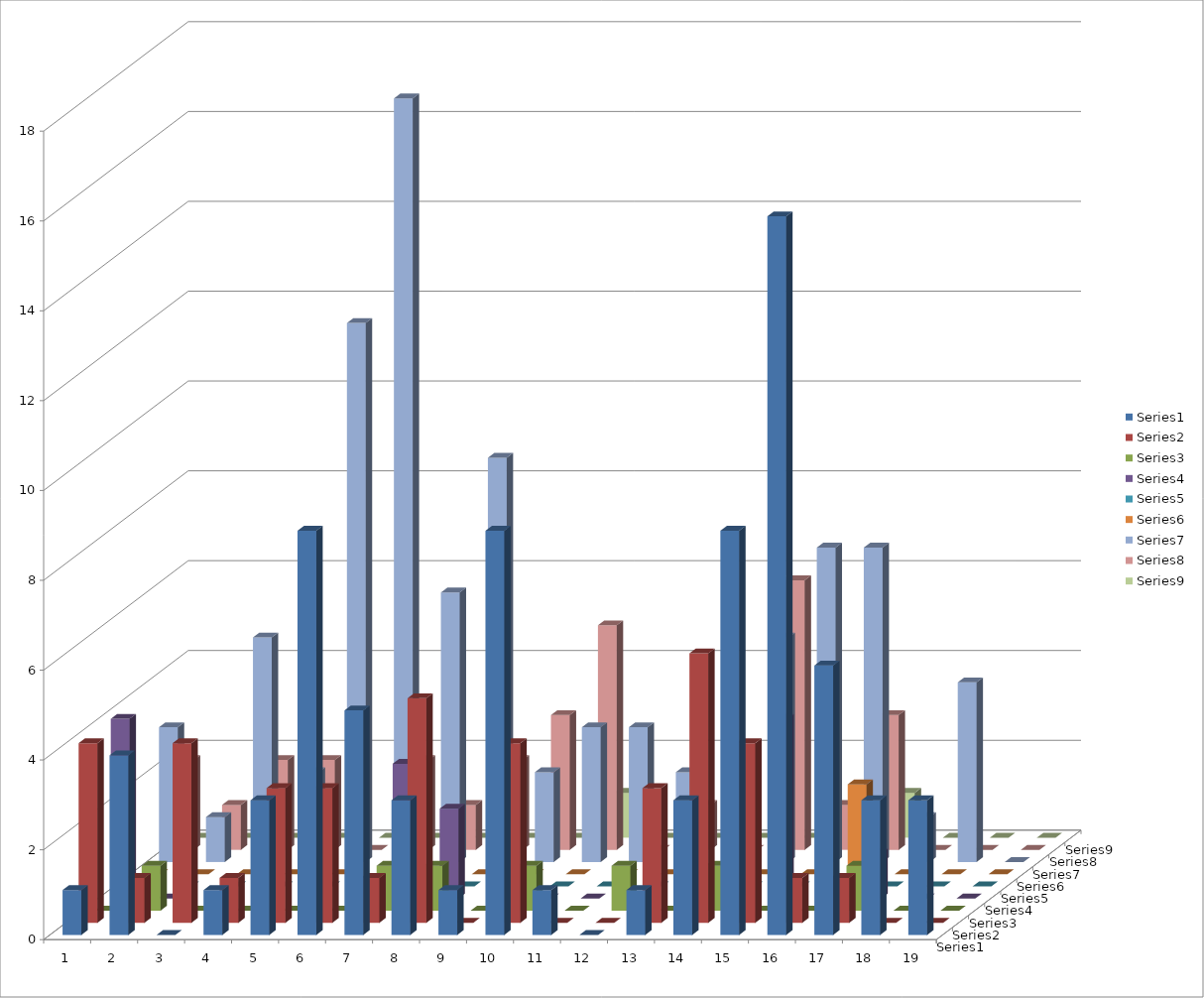
| Category | Series 0 | Series 1 | Series 2 | Series 3 | Series 4 | Series 5 | Series 6 | Series 7 | Series 8 |
|---|---|---|---|---|---|---|---|---|---|
| 0 | 1 | 4 | 0 | 4 | 0 | 0 | 3 | 2 | 0 |
| 1 | 4 | 1 | 1 | 0 | 0 | 0 | 1 | 1 | 0 |
| 2 | 0 | 4 | 0 | 0 | 0 | 0 | 5 | 2 | 0 |
| 3 | 1 | 1 | 0 | 0 | 0 | 0 | 2 | 2 | 0 |
| 4 | 3 | 3 | 0 | 0 | 0 | 0 | 12 | 0 | 0 |
| 5 | 9 | 3 | 0 | 0 | 0 | 0 | 17 | 2 | 0 |
| 6 | 5 | 1 | 1 | 3 | 0 | 0 | 6 | 1 | 0 |
| 7 | 3 | 5 | 1 | 2 | 0 | 0 | 9 | 2 | 0 |
| 8 | 1 | 0 | 0 | 3 | 0 | 0 | 2 | 3 | 0 |
| 9 | 9 | 4 | 1 | 0 | 0 | 0 | 3 | 5 | 1 |
| 10 | 1 | 0 | 0 | 0 | 0 | 0 | 3 | 0 | 0 |
| 11 | 0 | 0 | 1 | 0 | 0 | 0 | 2 | 1 | 0 |
| 12 | 1 | 3 | 0 | 0 | 0 | 0 | 2 | 0 | 0 |
| 13 | 3 | 6 | 1 | 1 | 0 | 0 | 5 | 6 | 0 |
| 14 | 9 | 4 | 0 | 4 | 0 | 0 | 7 | 1 | 0 |
| 15 | 16 | 1 | 0 | 0 | 0 | 2 | 7 | 3 | 1 |
| 16 | 6 | 1 | 1 | 1 | 0 | 0 | 1 | 0 | 0 |
| 17 | 3 | 0 | 0 | 0 | 0 | 0 | 4 | 0 | 0 |
| 18 | 3 | 0 | 0 | 0 | 0 | 0 | 0 | 0 | 0 |